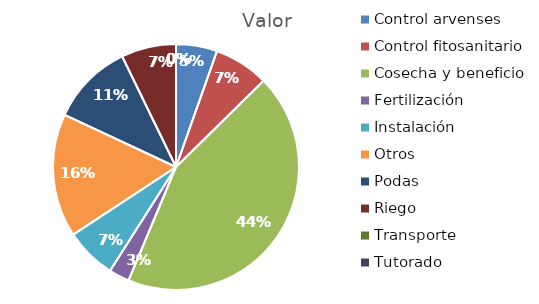
| Category | Valor |
|---|---|
| Control arvenses | 4055880 |
| Control fitosanitario | 5407840 |
| Cosecha y beneficio | 32750000 |
| Fertilización | 2027940 |
| Instalación | 5048351 |
| Otros | 12167640 |
| Podas | 8111760 |
| Riego | 5407840 |
| Transporte | 0 |
| Tutorado | 0 |